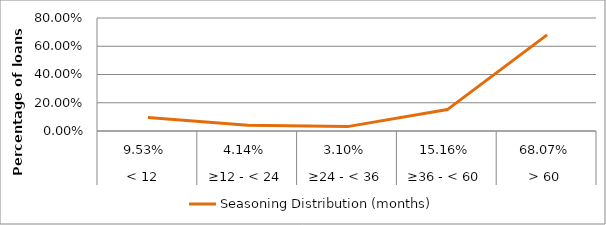
| Category | Seasoning Distribution (months) |
|---|---|
| 0 | 0.095 |
| 1 | 0.041 |
| 2 | 0.031 |
| 3 | 0.152 |
| 4 | 0.681 |